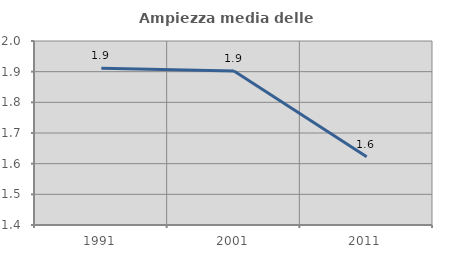
| Category | Ampiezza media delle famiglie |
|---|---|
| 1991.0 | 1.912 |
| 2001.0 | 1.902 |
| 2011.0 | 1.623 |